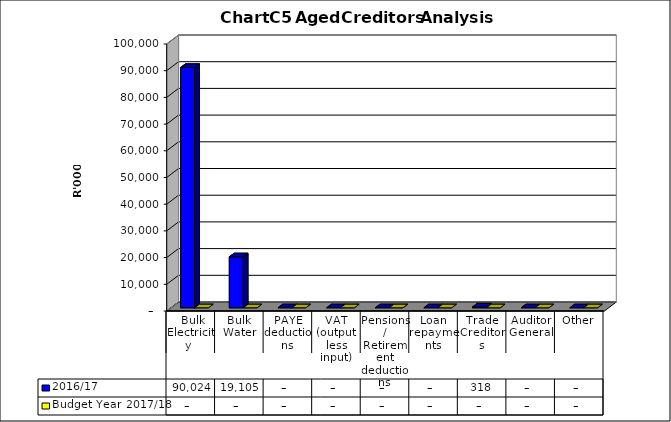
| Category | 2016/17 | Budget Year 2017/18 |
|---|---|---|
|  Bulk Electricity  | 90024223.33 | 0 |
| Bulk Water | 19105072.91 | 0 |
| PAYE deductions | 0 | 0 |
| VAT (output less input) | 0 | 0 |
| Pensions / Retirement deductions | 0 | 0 |
| Loan repayments | 0 | 0 |
| Trade Creditors | 318004.14 | 0 |
| Auditor General | 0 | 0 |
| Other | 0 | 0 |